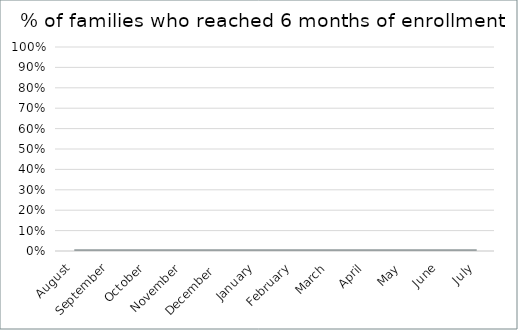
| Category | % of families who reached 6 months of enrollment |
|---|---|
| August | 0 |
| September | 0 |
| October | 0 |
| November | 0 |
| December  | 0 |
| January | 0 |
| February | 0 |
| March | 0 |
| April | 0 |
| May | 0 |
| June | 0 |
| July | 0 |